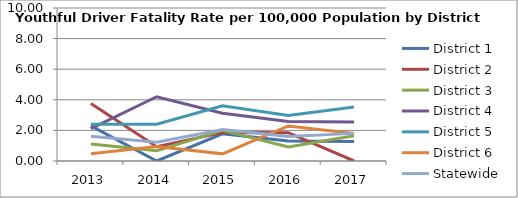
| Category | District 1 | District 2 | District 3 | District 4 | District 5 | District 6 | Statewide |
|---|---|---|---|---|---|---|---|
| 2013.0 | 2.298 | 3.753 | 1.107 | 2.118 | 2.408 | 0.475 | 1.613 |
| 2014.0 | 0 | 0.934 | 0.678 | 4.2 | 2.406 | 0.942 | 1.224 |
| 2015.0 | 1.778 | 1.862 | 2.001 | 3.119 | 3.605 | 0.467 | 2.054 |
| 2016.0 | 1.304 | 1.851 | 0.915 | 2.578 | 2.98 | 2.291 | 1.604 |
| 2017.0 | 1.277 | 0 | 1.656 | 2.542 | 3.533 | 1.8 | 1.805 |